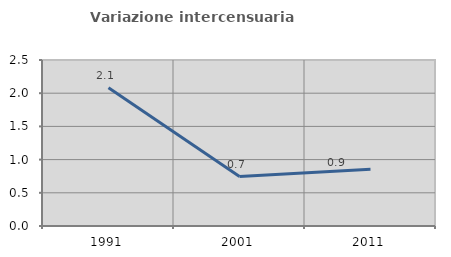
| Category | Variazione intercensuaria annua |
|---|---|
| 1991.0 | 2.082 |
| 2001.0 | 0.744 |
| 2011.0 | 0.854 |